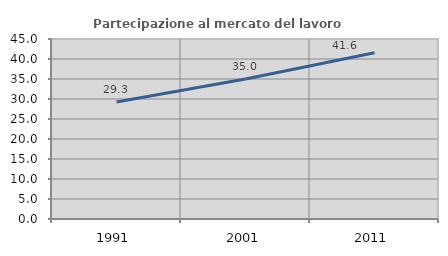
| Category | Partecipazione al mercato del lavoro  femminile |
|---|---|
| 1991.0 | 29.26 |
| 2001.0 | 35.016 |
| 2011.0 | 41.566 |